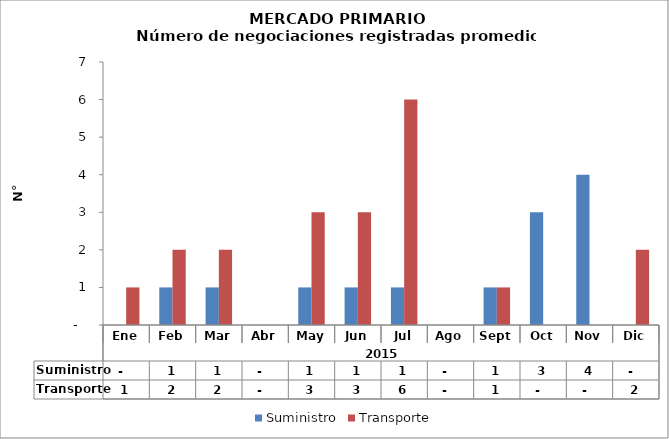
| Category | Suministro | Transporte |
|---|---|---|
| 0 | 0 | 1 |
| 1 | 1 | 2 |
| 2 | 1 | 2 |
| 3 | 0 | 0 |
| 4 | 1 | 3 |
| 5 | 1 | 3 |
| 6 | 1 | 6 |
| 7 | 0 | 0 |
| 8 | 1 | 1 |
| 9 | 3 | 0 |
| 10 | 4 | 0 |
| 11 | 0 | 2 |